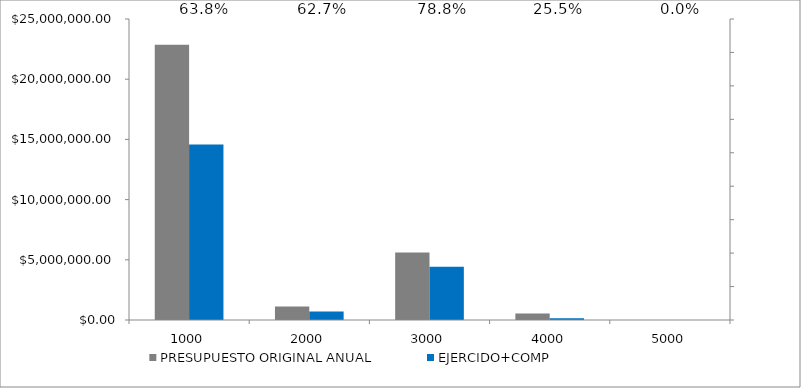
| Category | PRESUPUESTO ORIGINAL ANUAL | EJERCIDO+COMP |
|---|---|---|
| 1000.0 | 22862456 | 14581433.84 |
| 2000.0 | 1128884 | 707698.93 |
| 3000.0 | 5604895 | 4415938.05 |
| 4000.0 | 530650 | 135550 |
| 5000.0 | 0 | 0 |